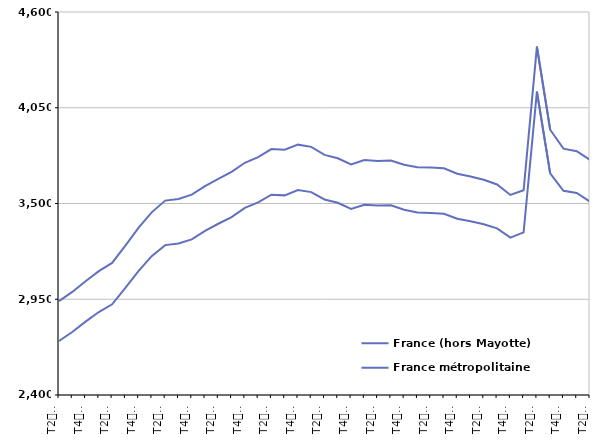
| Category | France (hors Mayotte) | France métropolitaine |
|---|---|---|
| T2
2011 | 2939 | 2710.3 |
| T3
2011 | 2992.2 | 2761.8 |
| T4
2011 | 3053.8 | 2821.4 |
| T1
2012 | 3111.4 | 2876.4 |
| T2
2012 | 3158.4 | 2920.8 |
| T3
2012 | 3257.4 | 3015.3 |
| T4
2012 | 3360.9 | 3113 |
| T1
2013 | 3450.6 | 3199.2 |
| T2
2013 | 3516.7 | 3260.9 |
| T3
2013 | 3526.2 | 3270.1 |
| T4
2013 | 3550.8 | 3293.8 |
| T1
2014 | 3599.5 | 3343 |
| T2
2014 | 3641.9 | 3383.7 |
| T3
2014 | 3681.3 | 3422.1 |
| T4
2014 | 3734 | 3474.8 |
| T1
2015 | 3766 | 3506.1 |
| T2
2015 | 3812.9 | 3550.5 |
| T3
2015 | 3808.8 | 3546.7 |
| T4
2015 | 3838.1 | 3577.7 |
| T1
2016 | 3825.3 | 3565.5 |
| T2
2016 | 3779.3 | 3523.3 |
| T3
2016 | 3759.7 | 3504 |
| T4
2016 | 3724.6 | 3468.4 |
| T1
2017 | 3749.2 | 3492.3 |
| T2
2017 | 3744.8 | 3488.6 |
| T3
2017 | 3746.9 | 3489.6 |
| T4
2017 | 3723 | 3464 |
| T1
2018 | 3708.6 | 3448.7 |
| T2
2018 | 3706.6 | 3445.4 |
| T3
2018 | 3702 | 3441.1 |
| T4
2018 | 3671.2 | 3412.7 |
| T1
2019 | 3654.9 | 3397.5 |
| T2
2019 | 3636.3 | 3381.2 |
| T3
2019 | 3609.2 | 3357.3 |
| T4
2019 | 3549.3 | 3303.9 |
| T1
2020 | 3576.6 | 3334.2 |
| T2
2020 | 4400.8 | 4142.7 |
| T3
2020 | 3923.9 | 3673.2 |
| T4
2020 | 3815.2 | 3572.8 |
| T1
2021 | 3800.7 | 3560.6 |
| T2
2021 | 3750.1 | 3510.5 |